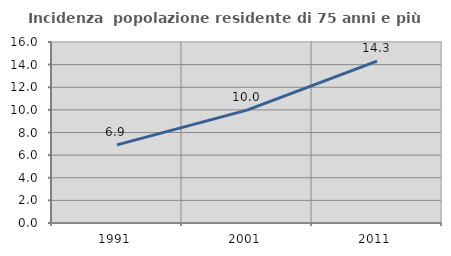
| Category | Incidenza  popolazione residente di 75 anni e più |
|---|---|
| 1991.0 | 6.907 |
| 2001.0 | 9.978 |
| 2011.0 | 14.303 |